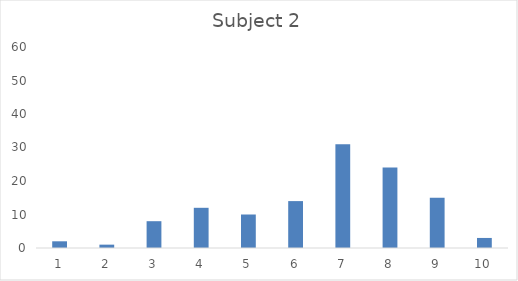
| Category | Series 0 |
|---|---|
| 0 | 2 |
| 1 | 1 |
| 2 | 8 |
| 3 | 12 |
| 4 | 10 |
| 5 | 14 |
| 6 | 31 |
| 7 | 24 |
| 8 | 15 |
| 9 | 3 |